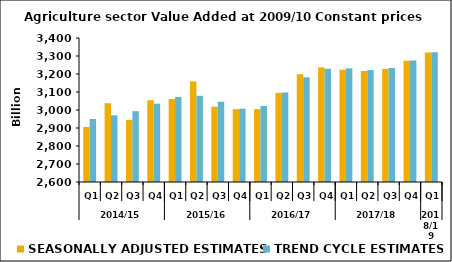
| Category | SEASONALLY ADJUSTED ESTIMATES | TREND CYCLE ESTIMATES |
|---|---|---|
| 0 | 2906.086 | 2950.034 |
| 1 | 3037.736 | 2970.319 |
| 2 | 2945.273 | 2993.469 |
| 3 | 3054.305 | 3035.225 |
| 4 | 3060.554 | 3071.762 |
| 5 | 3158.596 | 3078.824 |
| 6 | 3018.189 | 3046.014 |
| 7 | 3004.438 | 3007.164 |
| 8 | 3004.765 | 3022.278 |
| 9 | 3095.192 | 3097.269 |
| 10 | 3198.791 | 3181.62 |
| 11 | 3236.82 | 3228.774 |
| 12 | 3223.503 | 3231.425 |
| 13 | 3216.86 | 3221.853 |
| 14 | 3228.303 | 3233.208 |
| 15 | 3273.687 | 3275.083 |
| 16 | 3319.938 | 3321.38 |